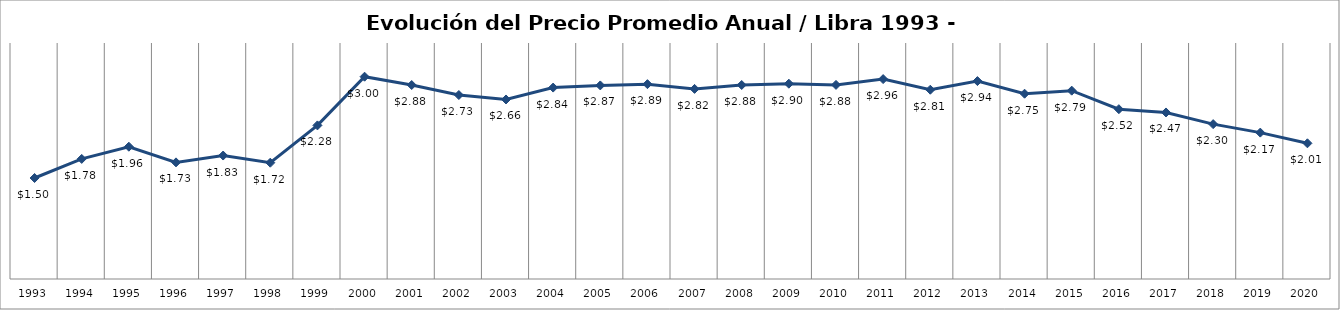
| Category | Series 0 |
|---|---|
| 1993.0 | 1.498 |
| 1994.0 | 1.781 |
| 1995.0 | 1.962 |
| 1996.0 | 1.73 |
| 1997.0 | 1.831 |
| 1998.0 | 1.725 |
| 1999.0 | 2.278 |
| 2000.0 | 3 |
| 2001.0 | 2.877 |
| 2002.0 | 2.728 |
| 2003.0 | 2.662 |
| 2004.0 | 2.839 |
| 2005.0 | 2.871 |
| 2006.0 | 2.889 |
| 2007.0 | 2.819 |
| 2008.0 | 2.877 |
| 2009.0 | 2.896 |
| 2010.0 | 2.879 |
| 2011.0 | 2.965 |
| 2012.0 | 2.807 |
| 2013.0 | 2.935 |
| 2014.0 | 2.748 |
| 2015.0 | 2.793 |
| 2016.0 | 2.519 |
| 2017.0 | 2.47 |
| 2018.0 | 2.297 |
| 2019.0 | 2.171 |
| 2020.0 | 2.012 |